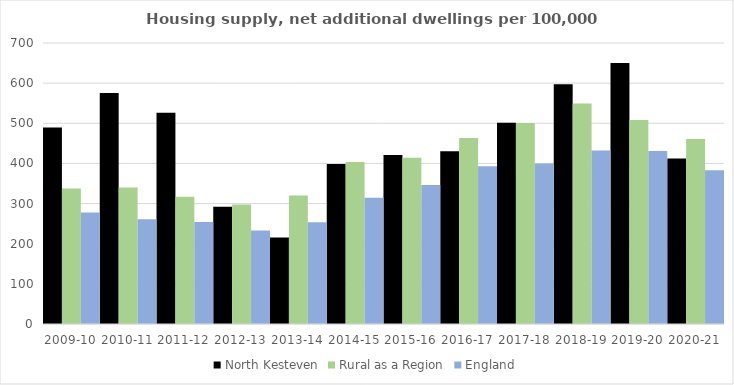
| Category | North Kesteven | Rural as a Region | England |
|---|---|---|---|
| 2009-10 | 489.686 | 337.852 | 277.548 |
| 2010-11 | 575.281 | 340.105 | 260.994 |
| 2011-12 | 526.18 | 317.04 | 254.007 |
| 2012-13 | 291.828 | 297.763 | 233.153 |
| 2013-14 | 215.582 | 319.835 | 253.602 |
| 2014-15 | 398.392 | 403.796 | 314.256 |
| 2015-16 | 420.73 | 414.091 | 346.154 |
| 2016-17 | 430.291 | 463.209 | 393.256 |
| 2017-18 | 501.605 | 500.68 | 399.646 |
| 2018-19 | 597.491 | 549.491 | 432.099 |
| 2019-20 | 650.045 | 508.493 | 431.187 |
| 2020-21 | 412.191 | 461.114 | 382.827 |